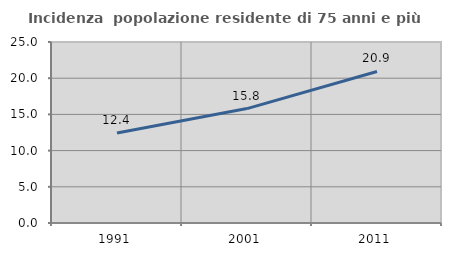
| Category | Incidenza  popolazione residente di 75 anni e più |
|---|---|
| 1991.0 | 12.426 |
| 2001.0 | 15.803 |
| 2011.0 | 20.93 |